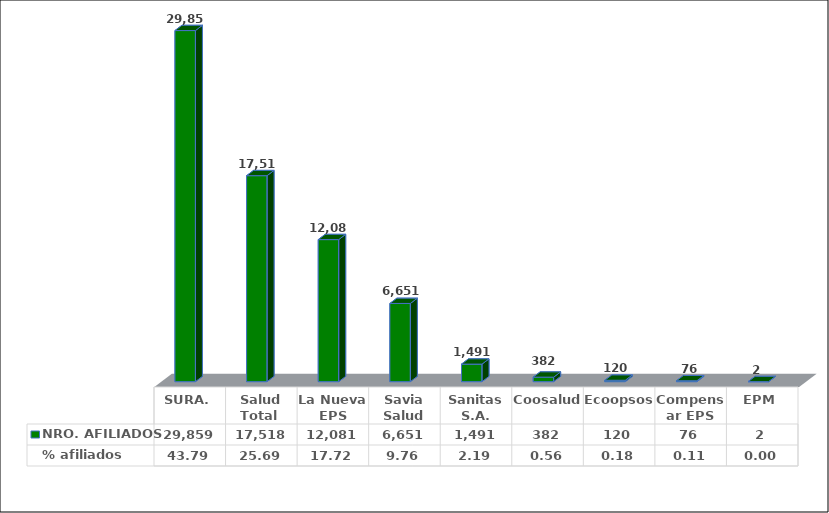
| Category | NRO. AFILIADOS | % afiliados |
|---|---|---|
| SURA. | 29859 | 43.794 |
| Salud Total  | 17518 | 25.694 |
| La Nueva EPS | 12081 | 17.719 |
| Savia Salud | 6651 | 9.755 |
| Sanitas S.A. | 1491 | 2.187 |
| Coosalud | 382 | 0.56 |
| Ecoopsos | 120 | 0.176 |
| Compensar EPS | 76 | 0.111 |
| EPM | 2 | 0.003 |